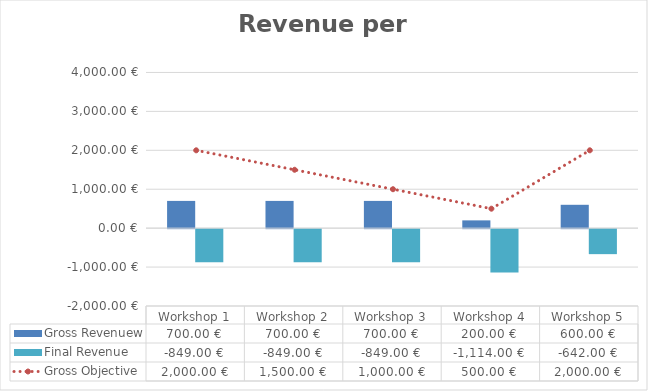
| Category | Gross Revenuew | Final Revenue |
|---|---|---|
| Workshop 1 | 700 | -849 |
| Workshop 2 | 700 | -849 |
| Workshop 3 | 700 | -849 |
| Workshop 4 | 200 | -1114 |
| Workshop 5 | 600 | -642 |